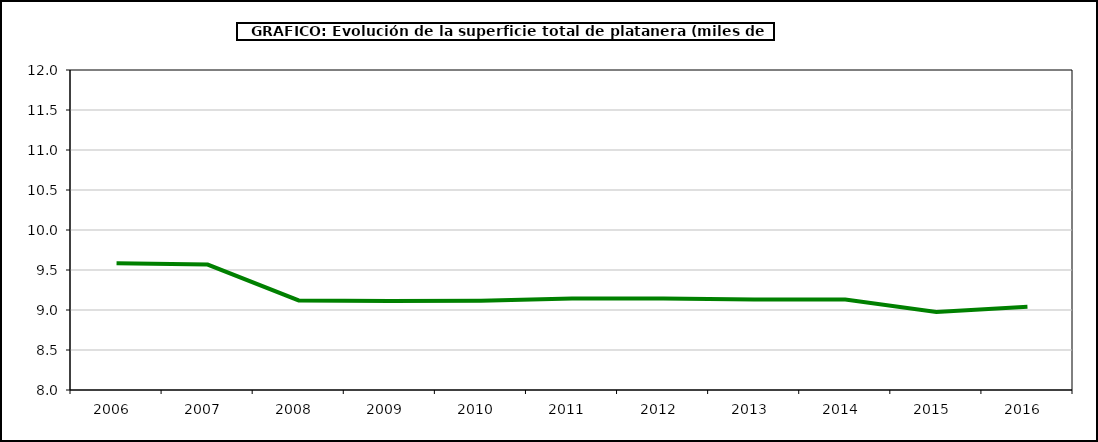
| Category | superficie platanera |
|---|---|
| 2006.0 | 9.585 |
| 2007.0 | 9.568 |
| 2008.0 | 9.119 |
| 2009.0 | 9.113 |
| 2010.0 | 9.117 |
| 2011.0 | 9.144 |
| 2012.0 | 9.144 |
| 2013.0 | 9.131 |
| 2014.0 | 9.13 |
| 2015.0 | 8.975 |
| 2016.0 | 9.04 |